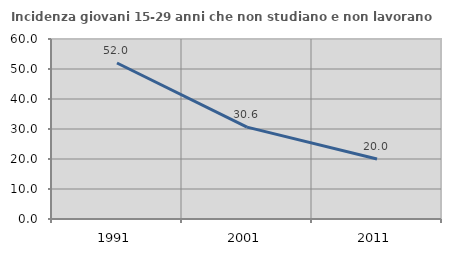
| Category | Incidenza giovani 15-29 anni che non studiano e non lavorano  |
|---|---|
| 1991.0 | 52 |
| 2001.0 | 30.612 |
| 2011.0 | 20 |